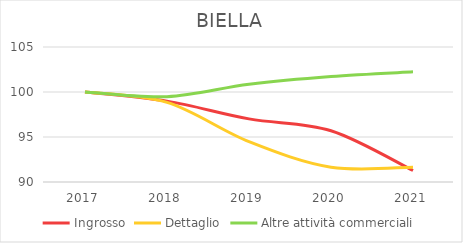
| Category | Ingrosso | Dettaglio | Altre attività commerciali |
|---|---|---|---|
| 2017.0 | 100 | 100 | 100 |
| 2018.0 | 98.984 | 98.844 | 99.483 |
| 2019.0 | 97.013 | 94.482 | 100.862 |
| 2020.0 | 95.699 | 91.648 | 101.724 |
| 2021.0 | 91.278 | 91.648 | 102.241 |